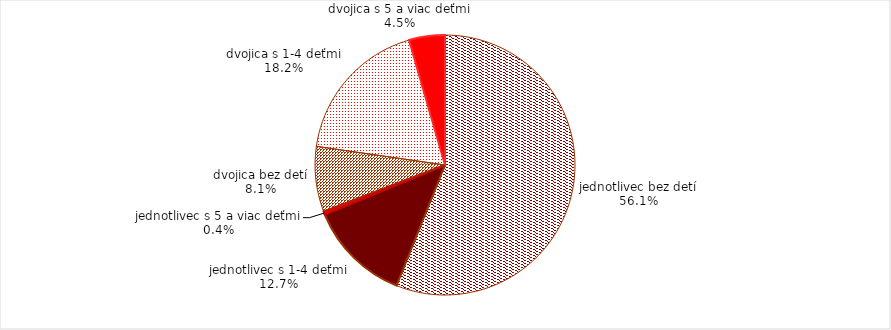
| Category | Series 0 |
|---|---|
| jednotlivec bez detí | 49199.833 |
| jednotlivec s 1-4 deťmi | 11134.833 |
| jednotlivec s 5 a viac deťmi | 338.583 |
| dvojica bez detí | 7136.667 |
| dvojica s 1-4 deťmi | 16005.167 |
| dvojica s 5 a viac deťmi | 3911.75 |